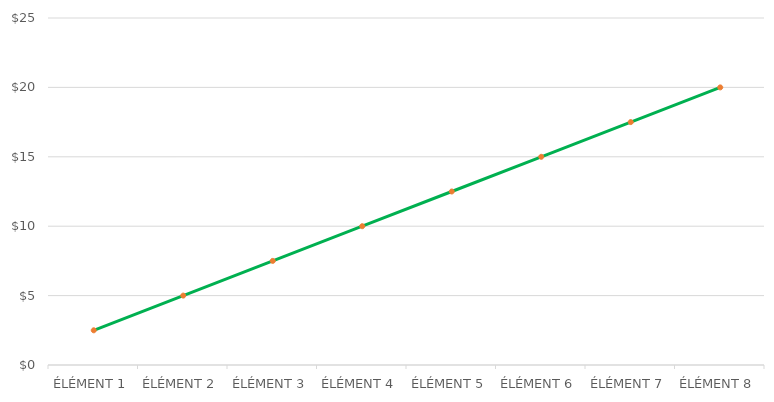
| Category | Series 1 |
|---|---|
| ÉLÉMENT 1 | 2.5 |
| ÉLÉMENT 2 | 5 |
| ÉLÉMENT 3 | 7.5 |
| ÉLÉMENT 4 | 10 |
| ÉLÉMENT 5 | 12.5 |
| ÉLÉMENT 6 | 15 |
| ÉLÉMENT 7 | 17.5 |
| ÉLÉMENT 8 | 20 |